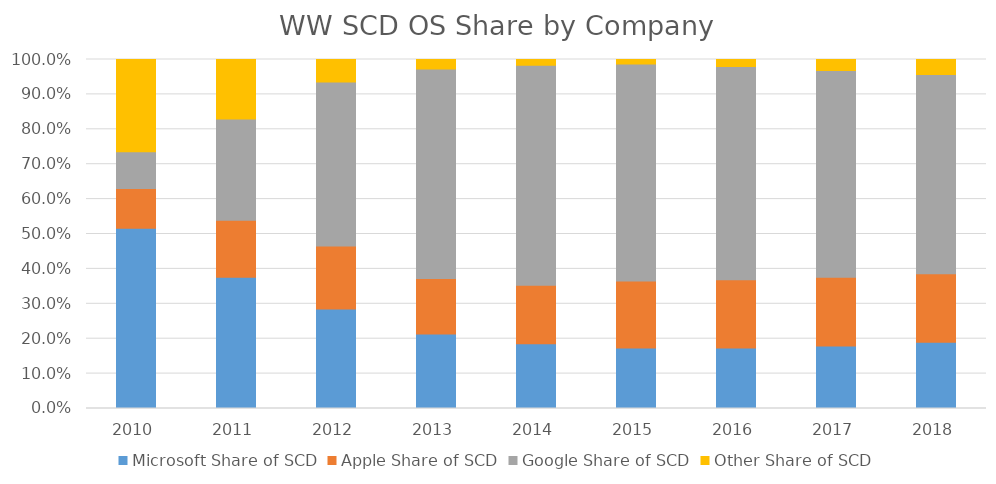
| Category | Microsoft Share of SCD | Apple Share of SCD | Google Share of SCD | Other Share of SCD |
|---|---|---|---|---|
| 2010.0 | 0.516 | 0.114 | 0.105 | 0.264 |
| 2011.0 | 0.376 | 0.163 | 0.29 | 0.171 |
| 2012.0 | 0.285 | 0.181 | 0.47 | 0.064 |
| 2013.0 | 0.213 | 0.159 | 0.601 | 0.027 |
| 2014.0 | 0.186 | 0.168 | 0.63 | 0.017 |
| 2015.0 | 0.174 | 0.192 | 0.621 | 0.013 |
| 2016.0 | 0.173 | 0.196 | 0.61 | 0.02 |
| 2017.0 | 0.179 | 0.197 | 0.593 | 0.031 |
| 2018.0 | 0.19 | 0.197 | 0.571 | 0.043 |